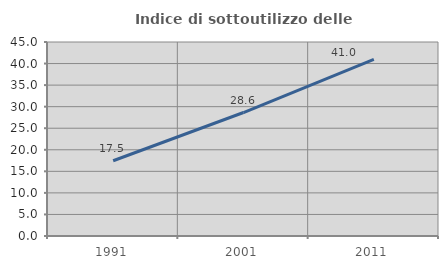
| Category | Indice di sottoutilizzo delle abitazioni  |
|---|---|
| 1991.0 | 17.46 |
| 2001.0 | 28.643 |
| 2011.0 | 40.991 |